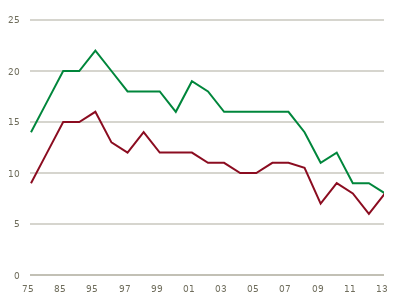
| Category | Mænd | Kvinder |
|---|---|---|
| 75 | 14 | 9 |
| 80 | 17 | 12 |
| 85 | 20 | 15 |
| 90 | 20 | 15 |
| 95 | 22 | 16 |
| 96 | 20 | 13 |
| 97 | 18 | 12 |
| 98 | 18 | 14 |
| 99 | 18 | 12 |
| 00 | 16 | 12 |
| 01 | 19 | 12 |
| 02 | 18 | 11 |
| 03 | 16 | 11 |
| 04 | 16 | 10 |
| 05 | 16 | 10 |
| 06 | 16 | 11 |
| 07 | 16 | 11 |
| 08 | 14 | 10.5 |
| 09 | 11 | 7 |
| 10 | 12 | 9 |
| 11 | 9 | 8 |
| 12 | 9 | 6 |
| 13 | 8 | 8 |